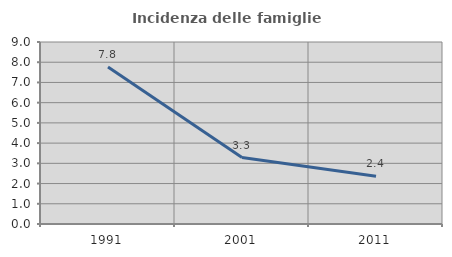
| Category | Incidenza delle famiglie numerose |
|---|---|
| 1991.0 | 7.758 |
| 2001.0 | 3.283 |
| 2011.0 | 2.358 |